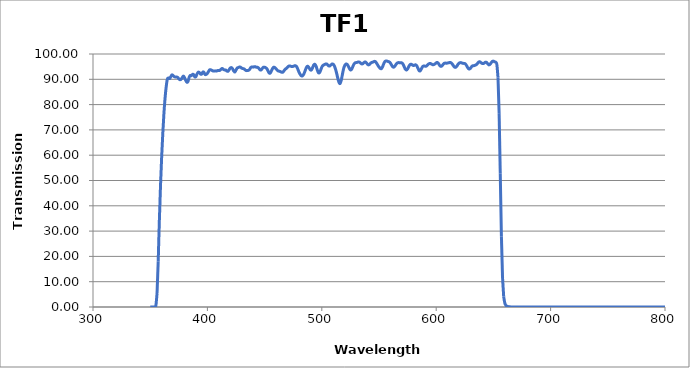
| Category | Transmission (%) |
|---|---|
| 350.0 | 0.001 |
| 351.0 | 0.001 |
| 352.0 | 0.002 |
| 353.0 | 0.01 |
| 354.0 | 0.053 |
| 355.0 | 0.686 |
| 356.0 | 5.515 |
| 357.0 | 18.103 |
| 358.0 | 34.021 |
| 359.0 | 47.763 |
| 360.0 | 59.092 |
| 361.0 | 68.491 |
| 362.0 | 76.522 |
| 363.0 | 82.638 |
| 364.0 | 87.098 |
| 365.0 | 90.066 |
| 366.0 | 90.541 |
| 367.0 | 90.283 |
| 368.0 | 91.04 |
| 369.0 | 91.756 |
| 370.0 | 91.484 |
| 371.0 | 91.067 |
| 372.0 | 90.908 |
| 373.0 | 90.894 |
| 374.0 | 90.765 |
| 375.0 | 90.185 |
| 376.0 | 89.849 |
| 377.0 | 89.999 |
| 378.0 | 90.663 |
| 379.0 | 91.283 |
| 380.0 | 90.696 |
| 381.0 | 89.601 |
| 382.0 | 88.847 |
| 383.0 | 89.103 |
| 384.0 | 90.725 |
| 385.0 | 91.521 |
| 386.0 | 91.443 |
| 387.0 | 91.944 |
| 388.0 | 91.833 |
| 389.0 | 90.955 |
| 390.0 | 91.122 |
| 391.0 | 92.179 |
| 392.0 | 92.818 |
| 393.0 | 92.683 |
| 394.0 | 92.067 |
| 395.0 | 92.059 |
| 396.0 | 92.874 |
| 397.0 | 92.741 |
| 398.0 | 91.885 |
| 399.0 | 91.939 |
| 400.0 | 92.375 |
| 401.0 | 93.096 |
| 402.0 | 93.741 |
| 403.0 | 93.748 |
| 404.0 | 93.506 |
| 405.0 | 93.269 |
| 406.0 | 93.277 |
| 407.0 | 93.331 |
| 408.0 | 93.285 |
| 409.0 | 93.45 |
| 410.0 | 93.511 |
| 411.0 | 93.544 |
| 412.0 | 94.015 |
| 413.0 | 94.283 |
| 414.0 | 93.881 |
| 415.0 | 93.709 |
| 416.0 | 93.661 |
| 417.0 | 93.261 |
| 418.0 | 93.163 |
| 419.0 | 93.79 |
| 420.0 | 94.47 |
| 421.0 | 94.603 |
| 422.0 | 94.181 |
| 423.0 | 93.301 |
| 424.0 | 92.859 |
| 425.0 | 93.664 |
| 426.0 | 94.428 |
| 427.0 | 94.636 |
| 428.0 | 94.847 |
| 429.0 | 94.768 |
| 430.0 | 94.404 |
| 431.0 | 94.248 |
| 432.0 | 94.115 |
| 433.0 | 93.718 |
| 434.0 | 93.442 |
| 435.0 | 93.457 |
| 436.0 | 93.56 |
| 437.0 | 94 |
| 438.0 | 94.696 |
| 439.0 | 94.891 |
| 440.0 | 94.802 |
| 441.0 | 94.971 |
| 442.0 | 94.942 |
| 443.0 | 94.728 |
| 444.0 | 94.718 |
| 445.0 | 94.308 |
| 446.0 | 93.711 |
| 447.0 | 93.729 |
| 448.0 | 94.307 |
| 449.0 | 94.781 |
| 450.0 | 94.754 |
| 451.0 | 94.572 |
| 452.0 | 94.154 |
| 453.0 | 93.301 |
| 454.0 | 92.477 |
| 455.0 | 92.499 |
| 456.0 | 93.352 |
| 457.0 | 94.297 |
| 458.0 | 94.804 |
| 459.0 | 94.606 |
| 460.0 | 94.162 |
| 461.0 | 93.632 |
| 462.0 | 93.283 |
| 463.0 | 93.185 |
| 464.0 | 92.977 |
| 465.0 | 92.785 |
| 466.0 | 92.827 |
| 467.0 | 93.408 |
| 468.0 | 93.996 |
| 469.0 | 94.279 |
| 470.0 | 94.736 |
| 471.0 | 95.179 |
| 472.0 | 95.296 |
| 473.0 | 95.131 |
| 474.0 | 95.02 |
| 475.0 | 95.119 |
| 476.0 | 95.308 |
| 477.0 | 95.361 |
| 478.0 | 95.003 |
| 479.0 | 94.044 |
| 480.0 | 92.893 |
| 481.0 | 92.033 |
| 482.0 | 91.435 |
| 483.0 | 91.328 |
| 484.0 | 91.854 |
| 485.0 | 92.864 |
| 486.0 | 94.101 |
| 487.0 | 95.018 |
| 488.0 | 95.061 |
| 489.0 | 94.439 |
| 490.0 | 93.729 |
| 491.0 | 93.721 |
| 492.0 | 94.683 |
| 493.0 | 95.697 |
| 494.0 | 95.922 |
| 495.0 | 95.165 |
| 496.0 | 93.758 |
| 497.0 | 92.645 |
| 498.0 | 92.619 |
| 499.0 | 93.611 |
| 500.0 | 94.817 |
| 501.0 | 95.483 |
| 502.0 | 95.731 |
| 503.0 | 95.974 |
| 504.0 | 96.093 |
| 505.0 | 95.784 |
| 506.0 | 95.314 |
| 507.0 | 95.264 |
| 508.0 | 95.685 |
| 509.0 | 96.05 |
| 510.0 | 95.93 |
| 511.0 | 95.271 |
| 512.0 | 94.029 |
| 513.0 | 92.317 |
| 514.0 | 90.395 |
| 515.0 | 88.787 |
| 516.0 | 88.321 |
| 517.0 | 89.583 |
| 518.0 | 91.908 |
| 519.0 | 94.084 |
| 520.0 | 95.412 |
| 521.0 | 95.997 |
| 522.0 | 95.943 |
| 523.0 | 95.342 |
| 524.0 | 94.4 |
| 525.0 | 93.721 |
| 526.0 | 93.914 |
| 527.0 | 94.896 |
| 528.0 | 95.904 |
| 529.0 | 96.474 |
| 530.0 | 96.609 |
| 531.0 | 96.703 |
| 532.0 | 96.849 |
| 533.0 | 96.751 |
| 534.0 | 96.354 |
| 535.0 | 96.064 |
| 536.0 | 96.217 |
| 537.0 | 96.667 |
| 538.0 | 96.858 |
| 539.0 | 96.501 |
| 540.0 | 95.926 |
| 541.0 | 95.694 |
| 542.0 | 96.026 |
| 543.0 | 96.494 |
| 544.0 | 96.708 |
| 545.0 | 96.872 |
| 546.0 | 97.088 |
| 547.0 | 96.936 |
| 548.0 | 96.298 |
| 549.0 | 95.523 |
| 550.0 | 94.875 |
| 551.0 | 94.344 |
| 552.0 | 94.193 |
| 553.0 | 94.821 |
| 554.0 | 95.99 |
| 555.0 | 96.906 |
| 556.0 | 97.231 |
| 557.0 | 97.19 |
| 558.0 | 97.04 |
| 559.0 | 96.859 |
| 560.0 | 96.393 |
| 561.0 | 95.604 |
| 562.0 | 94.933 |
| 563.0 | 94.812 |
| 564.0 | 95.294 |
| 565.0 | 95.984 |
| 566.0 | 96.454 |
| 567.0 | 96.592 |
| 568.0 | 96.578 |
| 569.0 | 96.583 |
| 570.0 | 96.468 |
| 571.0 | 95.959 |
| 572.0 | 94.997 |
| 573.0 | 94.015 |
| 574.0 | 93.661 |
| 575.0 | 94.087 |
| 576.0 | 95.008 |
| 577.0 | 95.753 |
| 578.0 | 95.963 |
| 579.0 | 95.736 |
| 580.0 | 95.465 |
| 581.0 | 95.56 |
| 582.0 | 95.735 |
| 583.0 | 95.36 |
| 584.0 | 94.4 |
| 585.0 | 93.47 |
| 586.0 | 93.336 |
| 587.0 | 94.105 |
| 588.0 | 94.92 |
| 589.0 | 95.259 |
| 590.0 | 95.207 |
| 591.0 | 95.154 |
| 592.0 | 95.446 |
| 593.0 | 95.926 |
| 594.0 | 96.203 |
| 595.0 | 96.232 |
| 596.0 | 95.985 |
| 597.0 | 95.766 |
| 598.0 | 95.832 |
| 599.0 | 96.114 |
| 600.0 | 96.483 |
| 601.0 | 96.651 |
| 602.0 | 96.215 |
| 603.0 | 95.511 |
| 604.0 | 95.125 |
| 605.0 | 95.275 |
| 606.0 | 95.845 |
| 607.0 | 96.331 |
| 608.0 | 96.402 |
| 609.0 | 96.361 |
| 610.0 | 96.447 |
| 611.0 | 96.552 |
| 612.0 | 96.63 |
| 613.0 | 96.542 |
| 614.0 | 96.059 |
| 615.0 | 95.386 |
| 616.0 | 94.847 |
| 617.0 | 94.735 |
| 618.0 | 95.176 |
| 619.0 | 95.871 |
| 620.0 | 96.387 |
| 621.0 | 96.588 |
| 622.0 | 96.541 |
| 623.0 | 96.352 |
| 624.0 | 96.288 |
| 625.0 | 96.236 |
| 626.0 | 95.822 |
| 627.0 | 95.041 |
| 628.0 | 94.296 |
| 629.0 | 94.044 |
| 630.0 | 94.399 |
| 631.0 | 95.021 |
| 632.0 | 95.351 |
| 633.0 | 95.398 |
| 634.0 | 95.534 |
| 635.0 | 95.778 |
| 636.0 | 96.223 |
| 637.0 | 96.765 |
| 638.0 | 96.954 |
| 639.0 | 96.651 |
| 640.0 | 96.295 |
| 641.0 | 96.209 |
| 642.0 | 96.418 |
| 643.0 | 96.743 |
| 644.0 | 96.689 |
| 645.0 | 96.139 |
| 646.0 | 95.706 |
| 647.0 | 95.88 |
| 648.0 | 96.498 |
| 649.0 | 97.065 |
| 650.0 | 97.176 |
| 651.0 | 96.91 |
| 652.0 | 96.773 |
| 653.0 | 95.91 |
| 654.0 | 90.818 |
| 655.0 | 76.629 |
| 656.0 | 52.692 |
| 657.0 | 27.959 |
| 658.0 | 11.436 |
| 659.0 | 4.088 |
| 660.0 | 1.501 |
| 661.0 | 0.609 |
| 662.0 | 0.284 |
| 663.0 | 0.146 |
| 664.0 | 0.082 |
| 665.0 | 0.048 |
| 666.0 | 0.029 |
| 667.0 | 0.017 |
| 668.0 | 0.01 |
| 669.0 | 0.006 |
| 670.0 | 0.004 |
| 671.0 | 0.002 |
| 672.0 | 0.002 |
| 673.0 | 0.001 |
| 674.0 | 0.001 |
| 675.0 | 0.001 |
| 676.0 | 0 |
| 677.0 | 0 |
| 678.0 | 0 |
| 679.0 | 0.001 |
| 680.0 | 0 |
| 681.0 | 0 |
| 682.0 | 0 |
| 683.0 | 0 |
| 684.0 | 0 |
| 685.0 | 0 |
| 686.0 | 0 |
| 687.0 | 0 |
| 688.0 | 0 |
| 689.0 | 0 |
| 690.0 | 0 |
| 691.0 | 0 |
| 692.0 | 0 |
| 693.0 | 0 |
| 694.0 | 0 |
| 695.0 | 0 |
| 696.0 | 0 |
| 697.0 | 0 |
| 698.0 | 0 |
| 699.0 | 0 |
| 700.0 | 0 |
| 701.0 | 0 |
| 702.0 | 0 |
| 703.0 | 0 |
| 704.0 | 0 |
| 705.0 | 0 |
| 706.0 | 0 |
| 707.0 | 0 |
| 708.0 | 0 |
| 709.0 | 0 |
| 710.0 | 0 |
| 711.0 | 0 |
| 712.0 | 0 |
| 713.0 | 0 |
| 714.0 | 0 |
| 715.0 | 0 |
| 716.0 | 0 |
| 717.0 | 0 |
| 718.0 | 0 |
| 719.0 | 0 |
| 720.0 | 0 |
| 721.0 | 0 |
| 722.0 | 0.001 |
| 723.0 | 0 |
| 724.0 | 0 |
| 725.0 | 0.001 |
| 726.0 | 0 |
| 727.0 | 0 |
| 728.0 | 0 |
| 729.0 | 0 |
| 730.0 | 0 |
| 731.0 | 0 |
| 732.0 | 0 |
| 733.0 | 0.001 |
| 734.0 | 0 |
| 735.0 | 0 |
| 736.0 | 0 |
| 737.0 | 0 |
| 738.0 | 0 |
| 739.0 | 0 |
| 740.0 | 0 |
| 741.0 | 0 |
| 742.0 | 0 |
| 743.0 | 0 |
| 744.0 | 0 |
| 745.0 | 0 |
| 746.0 | 0 |
| 747.0 | 0 |
| 748.0 | 0 |
| 749.0 | 0 |
| 750.0 | 0 |
| 751.0 | 0 |
| 752.0 | 0 |
| 753.0 | 0 |
| 754.0 | 0 |
| 755.0 | 0 |
| 756.0 | 0 |
| 757.0 | 0 |
| 758.0 | 0 |
| 759.0 | 0 |
| 760.0 | 0 |
| 761.0 | 0 |
| 762.0 | 0 |
| 763.0 | 0 |
| 764.0 | 0 |
| 765.0 | 0 |
| 766.0 | 0 |
| 767.0 | 0 |
| 768.0 | 0 |
| 769.0 | -0.001 |
| 770.0 | 0 |
| 771.0 | 0 |
| 772.0 | 0 |
| 773.0 | 0 |
| 774.0 | 0 |
| 775.0 | 0 |
| 776.0 | 0 |
| 777.0 | 0 |
| 778.0 | 0 |
| 779.0 | 0 |
| 780.0 | 0 |
| 781.0 | 0 |
| 782.0 | 0 |
| 783.0 | 0 |
| 784.0 | 0 |
| 785.0 | 0 |
| 786.0 | -0.001 |
| 787.0 | 0 |
| 788.0 | 0 |
| 789.0 | 0 |
| 790.0 | 0 |
| 791.0 | 0 |
| 792.0 | 0 |
| 793.0 | 0 |
| 794.0 | 0 |
| 795.0 | 0 |
| 796.0 | 0 |
| 797.0 | 0 |
| 798.0 | 0 |
| 799.0 | 0 |
| 800.0 | 0.001 |
| 801.0 | 0 |
| 802.0 | 0 |
| 803.0 | 0 |
| 804.0 | 0 |
| 805.0 | 0 |
| 806.0 | 0 |
| 807.0 | -0.001 |
| 808.0 | 0 |
| 809.0 | 0.002 |
| 810.0 | 0.001 |
| 811.0 | -0.001 |
| 812.0 | 0.001 |
| 813.0 | 0 |
| 814.0 | 0.001 |
| 815.0 | 0 |
| 816.0 | 0 |
| 817.0 | 0 |
| 818.0 | -0.001 |
| 819.0 | 0 |
| 820.0 | 0.001 |
| 821.0 | 0.001 |
| 822.0 | 0 |
| 823.0 | 0 |
| 824.0 | 0 |
| 825.0 | 0.001 |
| 826.0 | 0 |
| 827.0 | 0 |
| 828.0 | 0.002 |
| 829.0 | 0.001 |
| 830.0 | 0.001 |
| 831.0 | 0 |
| 832.0 | 0 |
| 833.0 | 0 |
| 834.0 | 0 |
| 835.0 | -0.002 |
| 836.0 | 0.001 |
| 837.0 | 0 |
| 838.0 | -0.001 |
| 839.0 | 0.001 |
| 840.0 | 0 |
| 841.0 | -0.001 |
| 842.0 | -0.002 |
| 843.0 | 0 |
| 844.0 | 0 |
| 845.0 | 0.002 |
| 846.0 | -0.001 |
| 847.0 | 0.001 |
| 848.0 | -0.001 |
| 849.0 | 0 |
| 850.0 | 0.002 |
| 851.0 | 0.001 |
| 852.0 | 0.002 |
| 853.0 | 0.001 |
| 854.0 | 0.001 |
| 855.0 | 0.001 |
| 856.0 | -0.002 |
| 857.0 | 0.001 |
| 858.0 | 0.001 |
| 859.0 | 0 |
| 860.0 | 0.001 |
| 861.0 | 0.001 |
| 862.0 | 0.001 |
| 863.0 | 0 |
| 864.0 | 0.001 |
| 865.0 | 0.001 |
| 866.0 | 0 |
| 867.0 | 0 |
| 868.0 | 0 |
| 869.0 | 0.001 |
| 870.0 | 0 |
| 871.0 | 0 |
| 872.0 | 0 |
| 873.0 | 0 |
| 874.0 | 0 |
| 875.0 | 0 |
| 876.0 | 0 |
| 877.0 | 0.001 |
| 878.0 | -0.001 |
| 879.0 | 0 |
| 880.0 | 0 |
| 881.0 | 0 |
| 882.0 | 0.002 |
| 883.0 | 0 |
| 884.0 | 0 |
| 885.0 | 0.002 |
| 886.0 | 0.001 |
| 887.0 | 0.001 |
| 888.0 | 0.001 |
| 889.0 | 0 |
| 890.0 | 0 |
| 891.0 | 0 |
| 892.0 | 0 |
| 893.0 | 0.001 |
| 894.0 | 0.001 |
| 895.0 | 0 |
| 896.0 | -0.001 |
| 897.0 | 0.001 |
| 898.0 | 0 |
| 899.0 | 0.001 |
| 900.0 | 0 |
| 901.0 | 0.001 |
| 902.0 | 0.001 |
| 903.0 | 0 |
| 904.0 | 0.001 |
| 905.0 | 0 |
| 906.0 | 0.001 |
| 907.0 | 0 |
| 908.0 | 0 |
| 909.0 | 0.001 |
| 910.0 | 0 |
| 911.0 | 0.001 |
| 912.0 | 0 |
| 913.0 | 0.001 |
| 914.0 | 0 |
| 915.0 | 0 |
| 916.0 | 0 |
| 917.0 | 0 |
| 918.0 | 0 |
| 919.0 | 0 |
| 920.0 | 0.001 |
| 921.0 | 0 |
| 922.0 | 0 |
| 923.0 | -0.001 |
| 924.0 | 0.001 |
| 925.0 | 0 |
| 926.0 | -0.001 |
| 927.0 | -0.001 |
| 928.0 | 0.001 |
| 929.0 | 0 |
| 930.0 | -0.001 |
| 931.0 | 0.001 |
| 932.0 | 0 |
| 933.0 | 0.001 |
| 934.0 | -0.001 |
| 935.0 | 0 |
| 936.0 | 0 |
| 937.0 | 0.001 |
| 938.0 | 0.001 |
| 939.0 | 0.001 |
| 940.0 | 0 |
| 941.0 | 0.001 |
| 942.0 | 0.002 |
| 943.0 | 0.001 |
| 944.0 | 0.001 |
| 945.0 | 0 |
| 946.0 | 0.001 |
| 947.0 | 0.001 |
| 948.0 | -0.001 |
| 949.0 | 0 |
| 950.0 | 0.001 |
| 951.0 | 0 |
| 952.0 | 0 |
| 953.0 | 0.001 |
| 954.0 | 0 |
| 955.0 | -0.001 |
| 956.0 | 0.001 |
| 957.0 | 0 |
| 958.0 | -0.001 |
| 959.0 | 0 |
| 960.0 | 0 |
| 961.0 | 0.001 |
| 962.0 | -0.001 |
| 963.0 | 0.001 |
| 964.0 | 0 |
| 965.0 | 0 |
| 966.0 | 0.001 |
| 967.0 | 0.002 |
| 968.0 | 0 |
| 969.0 | 0 |
| 970.0 | -0.001 |
| 971.0 | 0 |
| 972.0 | 0 |
| 973.0 | 0 |
| 974.0 | 0 |
| 975.0 | 0 |
| 976.0 | 0.001 |
| 977.0 | -0.001 |
| 978.0 | 0 |
| 979.0 | 0.002 |
| 980.0 | 0 |
| 981.0 | 0 |
| 982.0 | 0.001 |
| 983.0 | 0 |
| 984.0 | -0.001 |
| 985.0 | 0 |
| 986.0 | 0 |
| 987.0 | 0.001 |
| 988.0 | 0 |
| 989.0 | -0.001 |
| 990.0 | 0 |
| 991.0 | 0 |
| 992.0 | 0.001 |
| 993.0 | 0 |
| 994.0 | 0 |
| 995.0 | 0 |
| 996.0 | 0.001 |
| 997.0 | 0.001 |
| 998.0 | 0 |
| 999.0 | -0.001 |
| 1000.0 | 0.001 |
| 1001.0 | 0.001 |
| 1002.0 | -0.001 |
| 1003.0 | 0 |
| 1004.0 | 0.001 |
| 1005.0 | 0.001 |
| 1006.0 | 0.001 |
| 1007.0 | 0.001 |
| 1008.0 | 0 |
| 1009.0 | 0 |
| 1010.0 | 0.002 |
| 1011.0 | 0.001 |
| 1012.0 | 0.001 |
| 1013.0 | 0.001 |
| 1014.0 | 0 |
| 1015.0 | 0 |
| 1016.0 | 0.001 |
| 1017.0 | 0.001 |
| 1018.0 | 0 |
| 1019.0 | 0.001 |
| 1020.0 | 0.001 |
| 1021.0 | 0 |
| 1022.0 | 0 |
| 1023.0 | 0 |
| 1024.0 | 0.001 |
| 1025.0 | 0.001 |
| 1026.0 | 0 |
| 1027.0 | 0.001 |
| 1028.0 | -0.001 |
| 1029.0 | 0 |
| 1030.0 | 0 |
| 1031.0 | 0 |
| 1032.0 | 0.002 |
| 1033.0 | 0 |
| 1034.0 | 0.001 |
| 1035.0 | 0 |
| 1036.0 | 0.001 |
| 1037.0 | -0.001 |
| 1038.0 | 0 |
| 1039.0 | 0 |
| 1040.0 | 0.001 |
| 1041.0 | 0 |
| 1042.0 | 0 |
| 1043.0 | 0.001 |
| 1044.0 | 0.001 |
| 1045.0 | 0.001 |
| 1046.0 | 0.001 |
| 1047.0 | 0.001 |
| 1048.0 | -0.001 |
| 1049.0 | 0 |
| 1050.0 | 0.001 |
| 1051.0 | 0.001 |
| 1052.0 | 0.001 |
| 1053.0 | 0 |
| 1054.0 | 0 |
| 1055.0 | 0.001 |
| 1056.0 | 0.001 |
| 1057.0 | 0.001 |
| 1058.0 | 0 |
| 1059.0 | 0.001 |
| 1060.0 | 0.002 |
| 1061.0 | 0 |
| 1062.0 | -0.001 |
| 1063.0 | 0.001 |
| 1064.0 | 0 |
| 1065.0 | 0.001 |
| 1066.0 | 0 |
| 1067.0 | 0.001 |
| 1068.0 | 0 |
| 1069.0 | 0 |
| 1070.0 | 0.001 |
| 1071.0 | 0.001 |
| 1072.0 | 0.001 |
| 1073.0 | 0.001 |
| 1074.0 | 0 |
| 1075.0 | 0 |
| 1076.0 | 0 |
| 1077.0 | 0.001 |
| 1078.0 | -0.001 |
| 1079.0 | 0 |
| 1080.0 | 0 |
| 1081.0 | 0 |
| 1082.0 | 0.002 |
| 1083.0 | 0 |
| 1084.0 | 0 |
| 1085.0 | -0.001 |
| 1086.0 | 0 |
| 1087.0 | 0 |
| 1088.0 | 0.002 |
| 1089.0 | 0 |
| 1090.0 | 0 |
| 1091.0 | 0.001 |
| 1092.0 | 0.001 |
| 1093.0 | 0 |
| 1094.0 | 0.001 |
| 1095.0 | 0 |
| 1096.0 | 0 |
| 1097.0 | 0.001 |
| 1098.0 | 0 |
| 1099.0 | 0 |
| 1100.0 | 0 |
| 1101.0 | 0 |
| 1102.0 | 0 |
| 1103.0 | 0 |
| 1104.0 | 0.001 |
| 1105.0 | -0.001 |
| 1106.0 | 0 |
| 1107.0 | 0.001 |
| 1108.0 | 0.001 |
| 1109.0 | 0 |
| 1110.0 | 0.001 |
| 1111.0 | 0.001 |
| 1112.0 | 0.001 |
| 1113.0 | 0.001 |
| 1114.0 | 0 |
| 1115.0 | -0.001 |
| 1116.0 | 0.002 |
| 1117.0 | -0.001 |
| 1118.0 | 0.001 |
| 1119.0 | 0 |
| 1120.0 | -0.001 |
| 1121.0 | 0.001 |
| 1122.0 | 0 |
| 1123.0 | 0.002 |
| 1124.0 | 0.001 |
| 1125.0 | 0.001 |
| 1126.0 | 0 |
| 1127.0 | 0.001 |
| 1128.0 | 0.001 |
| 1129.0 | 0.001 |
| 1130.0 | 0.001 |
| 1131.0 | -0.001 |
| 1132.0 | 0.001 |
| 1133.0 | 0 |
| 1134.0 | 0.001 |
| 1135.0 | 0 |
| 1136.0 | 0 |
| 1137.0 | -0.001 |
| 1138.0 | 0 |
| 1139.0 | 0 |
| 1140.0 | 0 |
| 1141.0 | 0 |
| 1142.0 | -0.001 |
| 1143.0 | 0.001 |
| 1144.0 | 0 |
| 1145.0 | 0.001 |
| 1146.0 | 0 |
| 1147.0 | 0 |
| 1148.0 | 0.001 |
| 1149.0 | 0 |
| 1150.0 | 0.001 |
| 1151.0 | 0.001 |
| 1152.0 | 0 |
| 1153.0 | 0.002 |
| 1154.0 | 0 |
| 1155.0 | 0 |
| 1156.0 | 0 |
| 1157.0 | 0 |
| 1158.0 | 0 |
| 1159.0 | 0.001 |
| 1160.0 | 0.001 |
| 1161.0 | 0.001 |
| 1162.0 | 0 |
| 1163.0 | 0 |
| 1164.0 | 0 |
| 1165.0 | 0 |
| 1166.0 | -0.001 |
| 1167.0 | 0 |
| 1168.0 | 0 |
| 1169.0 | 0 |
| 1170.0 | 0.001 |
| 1171.0 | 0.001 |
| 1172.0 | 0 |
| 1173.0 | -0.001 |
| 1174.0 | 0 |
| 1175.0 | 0 |
| 1176.0 | 0 |
| 1177.0 | 0 |
| 1178.0 | 0 |
| 1179.0 | 0 |
| 1180.0 | 0 |
| 1181.0 | 0 |
| 1182.0 | 0.001 |
| 1183.0 | 0 |
| 1184.0 | 0.001 |
| 1185.0 | 0 |
| 1186.0 | 0 |
| 1187.0 | 0 |
| 1188.0 | 0 |
| 1189.0 | 0 |
| 1190.0 | -0.001 |
| 1191.0 | -0.001 |
| 1192.0 | 0 |
| 1193.0 | 0 |
| 1194.0 | 0.001 |
| 1195.0 | 0 |
| 1196.0 | 0 |
| 1197.0 | 0.001 |
| 1198.0 | 0 |
| 1199.0 | 0.001 |
| 1200.0 | -0.002 |
| 1201.0 | 0.001 |
| 1202.0 | 0.001 |
| 1203.0 | 0 |
| 1204.0 | 0 |
| 1205.0 | 0.001 |
| 1206.0 | 0 |
| 1207.0 | 0 |
| 1208.0 | 0 |
| 1209.0 | 0 |
| 1210.0 | 0.001 |
| 1211.0 | 0 |
| 1212.0 | 0 |
| 1213.0 | -0.001 |
| 1214.0 | 0 |
| 1215.0 | 0.001 |
| 1216.0 | 0 |
| 1217.0 | 0 |
| 1218.0 | -0.001 |
| 1219.0 | 0 |
| 1220.0 | 0 |
| 1221.0 | 0 |
| 1222.0 | 0 |
| 1223.0 | 0.001 |
| 1224.0 | 0.001 |
| 1225.0 | 0 |
| 1226.0 | 0.001 |
| 1227.0 | 0 |
| 1228.0 | 0.001 |
| 1229.0 | 0 |
| 1230.0 | -0.001 |
| 1231.0 | 0 |
| 1232.0 | -0.001 |
| 1233.0 | -0.001 |
| 1234.0 | 0 |
| 1235.0 | 0.001 |
| 1236.0 | 0 |
| 1237.0 | 0.001 |
| 1238.0 | 0.001 |
| 1239.0 | 0.002 |
| 1240.0 | 0 |
| 1241.0 | 0.002 |
| 1242.0 | -0.001 |
| 1243.0 | 0 |
| 1244.0 | 0.001 |
| 1245.0 | 0 |
| 1246.0 | 0.001 |
| 1247.0 | 0 |
| 1248.0 | -0.001 |
| 1249.0 | 0.001 |
| 1250.0 | 0 |
| 1251.0 | -0.001 |
| 1252.0 | 0.001 |
| 1253.0 | 0.001 |
| 1254.0 | 0.001 |
| 1255.0 | 0 |
| 1256.0 | 0 |
| 1257.0 | -0.001 |
| 1258.0 | 0.001 |
| 1259.0 | 0.001 |
| 1260.0 | 0.001 |
| 1261.0 | 0.001 |
| 1262.0 | -0.001 |
| 1263.0 | 0.001 |
| 1264.0 | 0 |
| 1265.0 | 0.001 |
| 1266.0 | 0.001 |
| 1267.0 | 0 |
| 1268.0 | 0 |
| 1269.0 | 0 |
| 1270.0 | 0 |
| 1271.0 | 0 |
| 1272.0 | 0 |
| 1273.0 | -0.001 |
| 1274.0 | 0.001 |
| 1275.0 | 0 |
| 1276.0 | 0 |
| 1277.0 | 0 |
| 1278.0 | 0.001 |
| 1279.0 | 0.001 |
| 1280.0 | 0.001 |
| 1281.0 | 0 |
| 1282.0 | 0.001 |
| 1283.0 | 0 |
| 1284.0 | 0.002 |
| 1285.0 | 0 |
| 1286.0 | 0 |
| 1287.0 | 0 |
| 1288.0 | 0 |
| 1289.0 | 0.001 |
| 1290.0 | -0.001 |
| 1291.0 | 0 |
| 1292.0 | 0.001 |
| 1293.0 | 0 |
| 1294.0 | 0 |
| 1295.0 | 0 |
| 1296.0 | 0.001 |
| 1297.0 | 0 |
| 1298.0 | 0 |
| 1299.0 | 0 |
| 1300.0 | 0.001 |
| 1301.0 | 0 |
| 1302.0 | 0 |
| 1303.0 | 0 |
| 1304.0 | 0 |
| 1305.0 | 0 |
| 1306.0 | 0.001 |
| 1307.0 | 0 |
| 1308.0 | 0 |
| 1309.0 | 0.001 |
| 1310.0 | 0 |
| 1311.0 | -0.001 |
| 1312.0 | -0.001 |
| 1313.0 | 0 |
| 1314.0 | 0.001 |
| 1315.0 | 0 |
| 1316.0 | 0 |
| 1317.0 | -0.001 |
| 1318.0 | 0 |
| 1319.0 | 0.001 |
| 1320.0 | 0 |
| 1321.0 | 0.002 |
| 1322.0 | -0.001 |
| 1323.0 | 0 |
| 1324.0 | 0.001 |
| 1325.0 | 0 |
| 1326.0 | 0.001 |
| 1327.0 | -0.001 |
| 1328.0 | 0 |
| 1329.0 | 0 |
| 1330.0 | 0.001 |
| 1331.0 | 0 |
| 1332.0 | -0.001 |
| 1333.0 | 0 |
| 1334.0 | 0.001 |
| 1335.0 | 0.001 |
| 1336.0 | 0 |
| 1337.0 | 0.001 |
| 1338.0 | 0.001 |
| 1339.0 | 0 |
| 1340.0 | 0 |
| 1341.0 | 0 |
| 1342.0 | 0 |
| 1343.0 | 0 |
| 1344.0 | 0.001 |
| 1345.0 | 0 |
| 1346.0 | 0 |
| 1347.0 | 0 |
| 1348.0 | 0 |
| 1349.0 | 0 |
| 1350.0 | 0 |
| 1351.0 | 0.001 |
| 1352.0 | 0.001 |
| 1353.0 | 0.001 |
| 1354.0 | 0 |
| 1355.0 | 0 |
| 1356.0 | 0.001 |
| 1357.0 | 0 |
| 1358.0 | 0 |
| 1359.0 | 0 |
| 1360.0 | 0 |
| 1361.0 | 0 |
| 1362.0 | -0.001 |
| 1363.0 | 0.001 |
| 1364.0 | -0.001 |
| 1365.0 | 0 |
| 1366.0 | 0.001 |
| 1367.0 | -0.001 |
| 1368.0 | -0.001 |
| 1369.0 | -0.001 |
| 1370.0 | 0 |
| 1371.0 | 0 |
| 1372.0 | 0 |
| 1373.0 | 0.001 |
| 1374.0 | 0.001 |
| 1375.0 | 0.001 |
| 1376.0 | 0.001 |
| 1377.0 | -0.001 |
| 1378.0 | 0 |
| 1379.0 | 0.002 |
| 1380.0 | 0.001 |
| 1381.0 | 0 |
| 1382.0 | 0.001 |
| 1383.0 | 0.001 |
| 1384.0 | 0.001 |
| 1385.0 | 0.001 |
| 1386.0 | -0.001 |
| 1387.0 | 0 |
| 1388.0 | 0 |
| 1389.0 | 0.001 |
| 1390.0 | -0.002 |
| 1391.0 | 0 |
| 1392.0 | 0 |
| 1393.0 | 0.002 |
| 1394.0 | 0 |
| 1395.0 | 0.001 |
| 1396.0 | 0 |
| 1397.0 | -0.002 |
| 1398.0 | 0 |
| 1399.0 | 0 |
| 1400.0 | -0.001 |
| 1401.0 | -0.001 |
| 1402.0 | 0 |
| 1403.0 | 0 |
| 1404.0 | 0 |
| 1405.0 | 0 |
| 1406.0 | 0.001 |
| 1407.0 | 0.003 |
| 1408.0 | 0 |
| 1409.0 | 0 |
| 1410.0 | 0 |
| 1411.0 | 0 |
| 1412.0 | 0.001 |
| 1413.0 | 0.001 |
| 1414.0 | 0 |
| 1415.0 | 0 |
| 1416.0 | 0 |
| 1417.0 | 0.001 |
| 1418.0 | 0 |
| 1419.0 | 0.002 |
| 1420.0 | 0.001 |
| 1421.0 | 0 |
| 1422.0 | 0 |
| 1423.0 | 0 |
| 1424.0 | 0.001 |
| 1425.0 | -0.001 |
| 1426.0 | 0 |
| 1427.0 | 0.001 |
| 1428.0 | -0.002 |
| 1429.0 | 0 |
| 1430.0 | 0 |
| 1431.0 | 0.002 |
| 1432.0 | -0.001 |
| 1433.0 | 0 |
| 1434.0 | 0.003 |
| 1435.0 | 0 |
| 1436.0 | 0.001 |
| 1437.0 | 0.001 |
| 1438.0 | 0.002 |
| 1439.0 | 0 |
| 1440.0 | 0.001 |
| 1441.0 | 0 |
| 1442.0 | 0.001 |
| 1443.0 | 0.001 |
| 1444.0 | 0 |
| 1445.0 | 0.001 |
| 1446.0 | 0.001 |
| 1447.0 | 0.002 |
| 1448.0 | 0.003 |
| 1449.0 | 0.005 |
| 1450.0 | 0.004 |
| 1451.0 | 0.004 |
| 1452.0 | 0.006 |
| 1453.0 | 0.008 |
| 1454.0 | 0.007 |
| 1455.0 | 0.009 |
| 1456.0 | 0.009 |
| 1457.0 | 0.009 |
| 1458.0 | 0.013 |
| 1459.0 | 0.015 |
| 1460.0 | 0.018 |
| 1461.0 | 0.025 |
| 1462.0 | 0.034 |
| 1463.0 | 0.05 |
| 1464.0 | 0.075 |
| 1465.0 | 0.12 |
| 1466.0 | 0.198 |
| 1467.0 | 0.343 |
| 1468.0 | 0.608 |
| 1469.0 | 1.033 |
| 1470.0 | 1.633 |
| 1471.0 | 2.227 |
| 1472.0 | 2.664 |
| 1473.0 | 3.033 |
| 1474.0 | 3.535 |
| 1475.0 | 4.456 |
| 1476.0 | 6.323 |
| 1477.0 | 10.088 |
| 1478.0 | 17.874 |
| 1479.0 | 31.123 |
| 1480.0 | 41.977 |
| 1481.0 | 33.048 |
| 1482.0 | 19.75 |
| 1483.0 | 12.539 |
| 1484.0 | 9.204 |
| 1485.0 | 7.601 |
| 1486.0 | 6.865 |
| 1487.0 | 6.729 |
| 1488.0 | 7.059 |
| 1489.0 | 7.88 |
| 1490.0 | 9.267 |
| 1491.0 | 11.489 |
| 1492.0 | 14.767 |
| 1493.0 | 19.367 |
| 1494.0 | 25.433 |
| 1495.0 | 31.976 |
| 1496.0 | 37.713 |
| 1497.0 | 41.03 |
| 1498.0 | 41.994 |
| 1499.0 | 41.817 |
| 1500.0 | 41.845 |